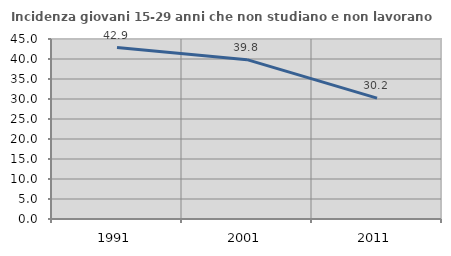
| Category | Incidenza giovani 15-29 anni che non studiano e non lavorano  |
|---|---|
| 1991.0 | 42.857 |
| 2001.0 | 39.831 |
| 2011.0 | 30.233 |